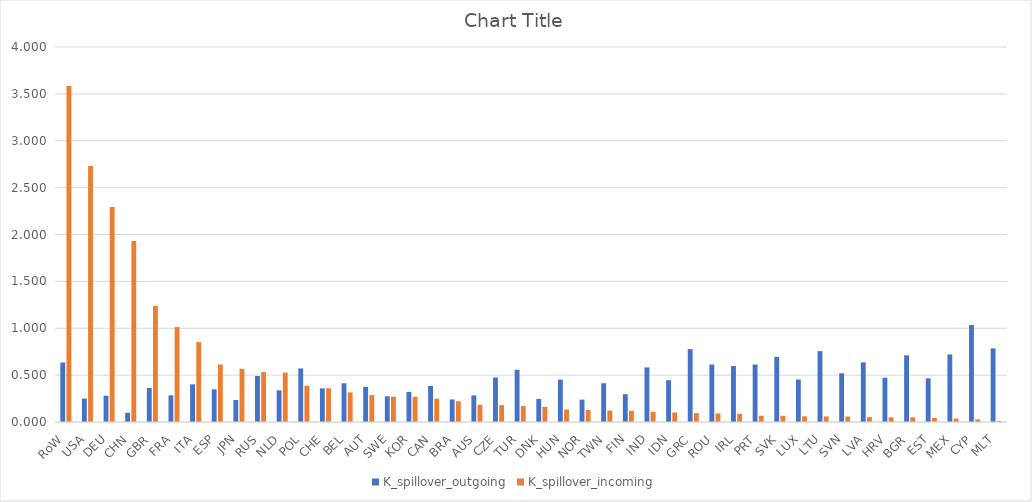
| Category | K_spillover_outgoing | K_spillover_incoming |
|---|---|---|
| RoW | 0.635 | 3.585 |
| USA | 0.25 | 2.732 |
| DEU | 0.28 | 2.294 |
| CHN | 0.098 | 1.93 |
| GBR | 0.363 | 1.237 |
| FRA | 0.284 | 1.012 |
| ITA | 0.402 | 0.852 |
| ESP | 0.348 | 0.613 |
| JPN | 0.235 | 0.567 |
| RUS | 0.491 | 0.533 |
| NLD | 0.338 | 0.527 |
| POL | 0.572 | 0.387 |
| CHE | 0.359 | 0.36 |
| BEL | 0.413 | 0.316 |
| AUT | 0.375 | 0.287 |
| SWE | 0.275 | 0.269 |
| KOR | 0.321 | 0.269 |
| CAN | 0.384 | 0.249 |
| BRA | 0.24 | 0.221 |
| AUS | 0.284 | 0.184 |
| CZE | 0.474 | 0.18 |
| TUR | 0.557 | 0.17 |
| DNK | 0.247 | 0.162 |
| HUN | 0.452 | 0.133 |
| NOR | 0.238 | 0.127 |
| TWN | 0.413 | 0.123 |
| FIN | 0.297 | 0.119 |
| IND | 0.582 | 0.109 |
| IDN | 0.446 | 0.101 |
| GRC | 0.778 | 0.094 |
| ROU | 0.613 | 0.091 |
| IRL | 0.597 | 0.087 |
| PRT | 0.613 | 0.067 |
| SVK | 0.695 | 0.066 |
| LUX | 0.453 | 0.061 |
| LTU | 0.756 | 0.059 |
| SVN | 0.52 | 0.058 |
| LVA | 0.636 | 0.052 |
| HRV | 0.472 | 0.05 |
| BGR | 0.711 | 0.049 |
| EST | 0.466 | 0.043 |
| MEX | 0.72 | 0.037 |
| CYP | 1.034 | 0.028 |
| MLT | 0.785 | 0.011 |